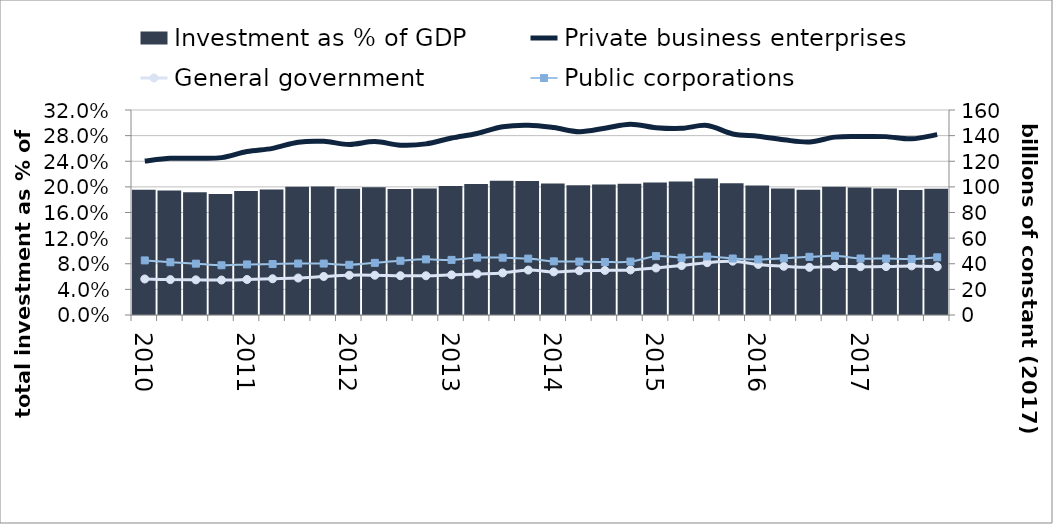
| Category |  Investment as % of GDP  |
|---|---|
| 2010.0 | 0.196 |
| nan | 0.195 |
| nan | 0.192 |
| nan | 0.189 |
| 2011.0 | 0.193 |
| nan | 0.196 |
| nan | 0.2 |
| nan | 0.201 |
| 2012.0 | 0.197 |
| nan | 0.199 |
| nan | 0.197 |
| nan | 0.197 |
| 2013.0 | 0.201 |
| nan | 0.204 |
| nan | 0.21 |
| nan | 0.209 |
| 2014.0 | 0.205 |
| nan | 0.202 |
| nan | 0.204 |
| nan | 0.205 |
| 2015.0 | 0.207 |
| nan | 0.208 |
| nan | 0.213 |
| nan | 0.206 |
| 2016.0 | 0.202 |
| nan | 0.197 |
| nan | 0.195 |
| nan | 0.2 |
| 2017.0 | 0.199 |
| nan | 0.197 |
| nan | 0.195 |
| nan | 0.197 |